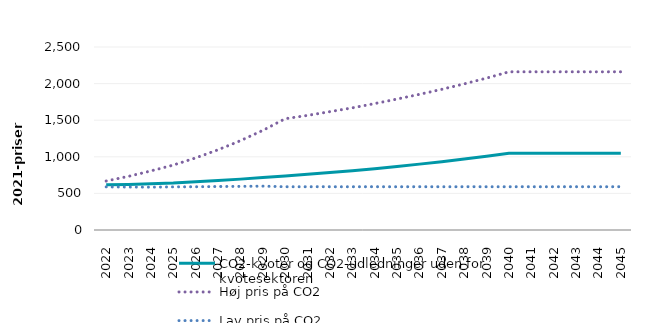
| Category | CO2-kvoter og CO2-udledninger uden for kvotesektoren | Høj pris på CO2 | Lav pris på CO2 |
|---|---|---|---|
| 2022.0 | 617 | 669 | 589 |
| 2023.0 | 623 | 733 | 587 |
| 2024.0 | 633 | 807 | 585 |
| 2025.0 | 642 | 887 | 589 |
| 2026.0 | 658 | 985 | 591 |
| 2027.0 | 676 | 1096 | 594 |
| 2028.0 | 695 | 1220 | 596 |
| 2029.0 | 716 | 1361 | 599 |
| 2030.0 | 738 | 1520 | 591 |
| 2031.0 | 760 | 1566 | 591 |
| 2032.0 | 785 | 1617 | 591 |
| 2033.0 | 811 | 1669 | 591 |
| 2034.0 | 838 | 1727 | 591 |
| 2035.0 | 868 | 1789 | 591 |
| 2036.0 | 900 | 1853 | 591 |
| 2037.0 | 933 | 1922 | 591 |
| 2038.0 | 969 | 1996 | 591 |
| 2039.0 | 1008 | 2075 | 591 |
| 2040.0 | 1049 | 2161 | 591 |
| 2041.0 | 1049 | 2161 | 591 |
| 2042.0 | 1049 | 2161 | 591 |
| 2043.0 | 1049 | 2161 | 591 |
| 2044.0 | 1049 | 2161 | 591 |
| 2045.0 | 1049 | 2161 | 591 |